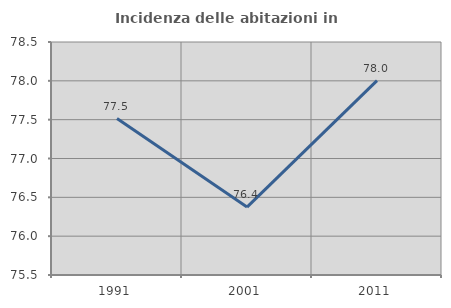
| Category | Incidenza delle abitazioni in proprietà  |
|---|---|
| 1991.0 | 77.514 |
| 2001.0 | 76.374 |
| 2011.0 | 78.002 |